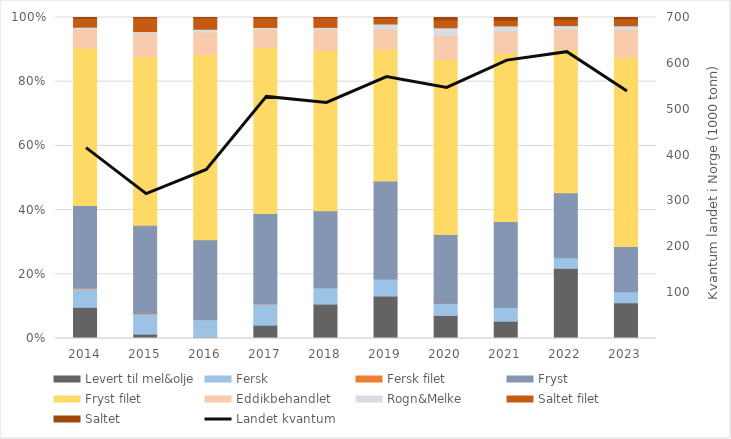
| Category | Levert til mel&olje | Fersk | Fersk filet | Fryst | Fryst filet | Eddikbehandlet | Rogn&Melke | Saltet filet | Saltet |
|---|---|---|---|---|---|---|---|---|---|
| 2014.0 | 52.321 | 32.109 | 1.074 | 137.512 | 264.468 | 31.77 | 3.149 | 15.097 | 1.144 |
| 2015.0 | 4.825 | 22.665 | 1.003 | 97.481 | 187.736 | 26.037 | 1.75 | 15.09 | 0.596 |
| 2016.0 | 1.956 | 21.772 | 0.124 | 100.345 | 233.574 | 27.499 | 3.733 | 14.353 | 0.409 |
| 2017.0 | 20.468 | 32.678 | 0.538 | 138.541 | 255.221 | 28.276 | 2.556 | 14.501 | 0.779 |
| 2018.0 | 58.149 | 27.842 | 0.027 | 129.948 | 271.26 | 35.619 | 3.246 | 16.2 | 0.464 |
| 2019.0 | 82.269 | 33.381 | 0 | 190.025 | 255.597 | 39.605 | 9.265 | 11.272 | 1.316 |
| 2020.0 | 42.712 | 22.648 | 0.014 | 127.045 | 323.793 | 44.879 | 14.164 | 14.679 | 4.402 |
| 2021.0 | 32.798 | 26.166 | 0 | 163.601 | 320.312 | 41.735 | 9.509 | 10.793 | 5.224 |
| 2022.0 | 138.625 | 20.749 | 0 | 128.616 | 283.412 | 40.176 | 6.789 | 11.898 | 4.13 |
| 2023.0 | 56.744 | 17.707 | 0 | 71.923 | 300.837 | 44.109 | 5.807 | 11.003 | 2.188 |